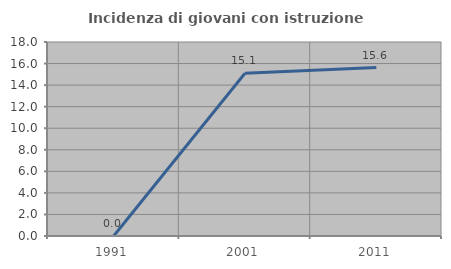
| Category | Incidenza di giovani con istruzione universitaria |
|---|---|
| 1991.0 | 0 |
| 2001.0 | 15.094 |
| 2011.0 | 15.625 |